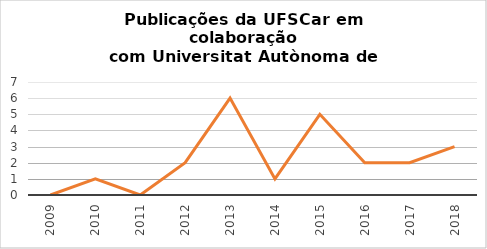
| Category | # Records |
|---|---|
| 2018.0 | 3 |
| 2017.0 | 2 |
| 2016.0 | 2 |
| 2015.0 | 5 |
| 2014.0 | 1 |
| 2013.0 | 6 |
| 2012.0 | 2 |
| 2011.0 | 0 |
| 2010.0 | 1 |
| 2009.0 | 0 |